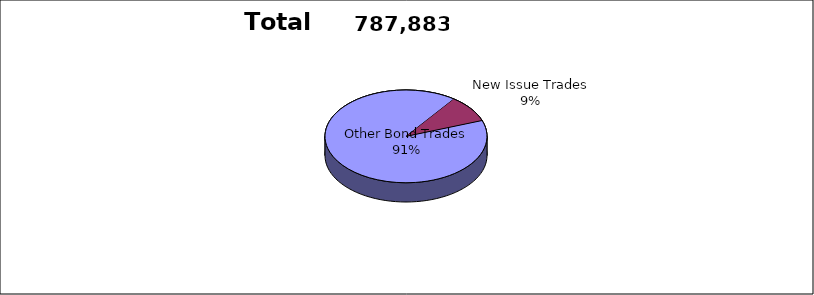
| Category | Series 0 |
|---|---|
| Other Bond Trades | 714092 |
| New Issue Trades | 73791 |